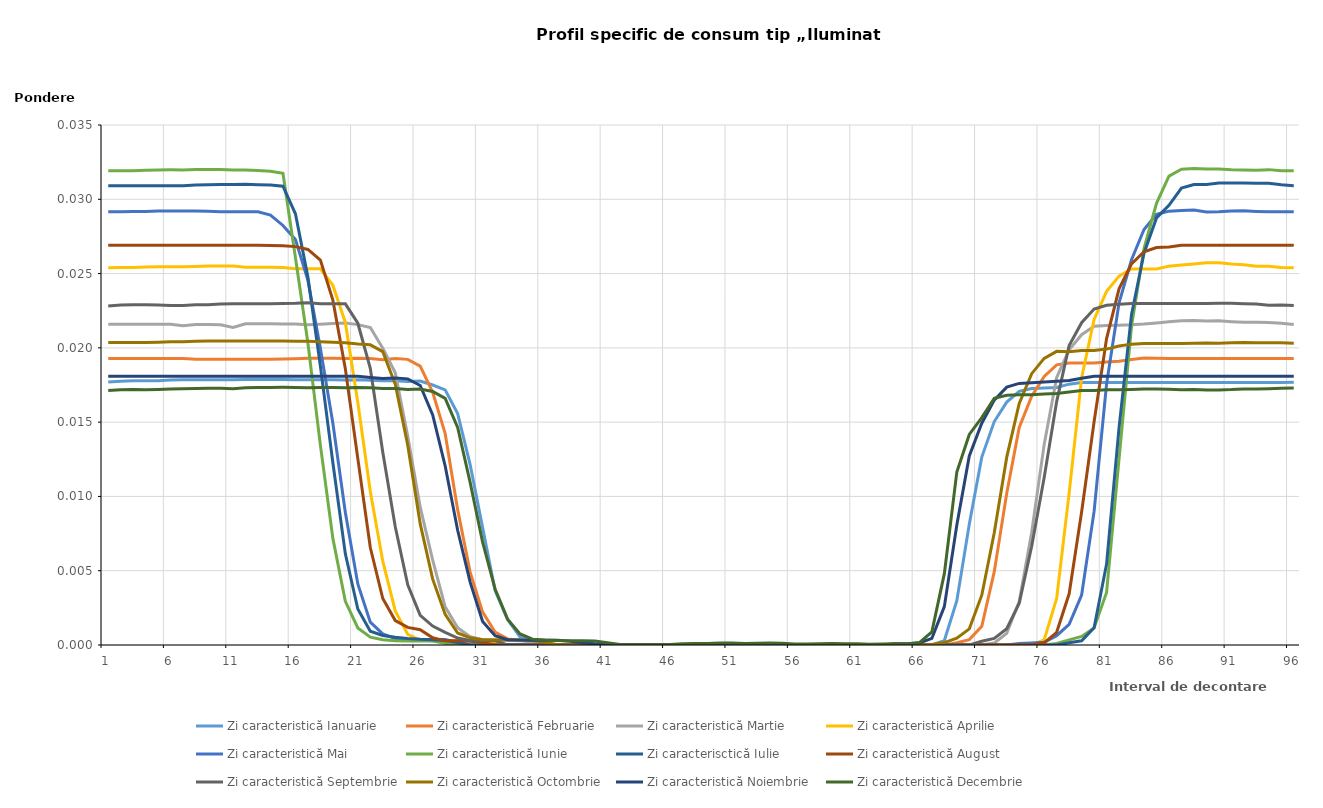
| Category | Zi caracteristică Ianuarie | Zi caracteristică Februarie | Zi caracteristică Martie | Zi caracteristică Aprilie | Zi caracteristică Mai | Zi caracteristică Iunie | Zi caracterisctică Iulie | Zi caracteristică August | Zi caracteristică Septembrie | Zi caracteristică Octombrie | Zi caracteristică Noiembrie | Zi caracteristică Decembrie |
|---|---|---|---|---|---|---|---|---|---|---|---|---|
| 1.0 | 0.018 | 0.019 | 0.022 | 0.025 | 0.029 | 0.032 | 0.031 | 0.027 | 0.023 | 0.02 | 0.018 | 0.017 |
| 2.0 | 0.018 | 0.019 | 0.022 | 0.025 | 0.029 | 0.032 | 0.031 | 0.027 | 0.023 | 0.02 | 0.018 | 0.017 |
| 3.0 | 0.018 | 0.019 | 0.022 | 0.025 | 0.029 | 0.032 | 0.031 | 0.027 | 0.023 | 0.02 | 0.018 | 0.017 |
| 4.0 | 0.018 | 0.019 | 0.022 | 0.025 | 0.029 | 0.032 | 0.031 | 0.027 | 0.023 | 0.02 | 0.018 | 0.017 |
| 5.0 | 0.018 | 0.019 | 0.022 | 0.025 | 0.029 | 0.032 | 0.031 | 0.027 | 0.023 | 0.02 | 0.018 | 0.017 |
| 6.0 | 0.018 | 0.019 | 0.022 | 0.025 | 0.029 | 0.032 | 0.031 | 0.027 | 0.023 | 0.02 | 0.018 | 0.017 |
| 7.0 | 0.018 | 0.019 | 0.021 | 0.025 | 0.029 | 0.032 | 0.031 | 0.027 | 0.023 | 0.02 | 0.018 | 0.017 |
| 8.0 | 0.018 | 0.019 | 0.022 | 0.025 | 0.029 | 0.032 | 0.031 | 0.027 | 0.023 | 0.02 | 0.018 | 0.017 |
| 9.0 | 0.018 | 0.019 | 0.022 | 0.026 | 0.029 | 0.032 | 0.031 | 0.027 | 0.023 | 0.02 | 0.018 | 0.017 |
| 10.0 | 0.018 | 0.019 | 0.022 | 0.026 | 0.029 | 0.032 | 0.031 | 0.027 | 0.023 | 0.02 | 0.018 | 0.017 |
| 11.0 | 0.018 | 0.019 | 0.021 | 0.026 | 0.029 | 0.032 | 0.031 | 0.027 | 0.023 | 0.02 | 0.018 | 0.017 |
| 12.0 | 0.018 | 0.019 | 0.022 | 0.025 | 0.029 | 0.032 | 0.031 | 0.027 | 0.023 | 0.02 | 0.018 | 0.017 |
| 13.0 | 0.018 | 0.019 | 0.022 | 0.025 | 0.029 | 0.032 | 0.031 | 0.027 | 0.023 | 0.02 | 0.018 | 0.017 |
| 14.0 | 0.018 | 0.019 | 0.022 | 0.025 | 0.029 | 0.032 | 0.031 | 0.027 | 0.023 | 0.02 | 0.018 | 0.017 |
| 15.0 | 0.018 | 0.019 | 0.022 | 0.025 | 0.028 | 0.032 | 0.031 | 0.027 | 0.023 | 0.02 | 0.018 | 0.017 |
| 16.0 | 0.018 | 0.019 | 0.022 | 0.025 | 0.027 | 0.026 | 0.029 | 0.027 | 0.023 | 0.02 | 0.018 | 0.017 |
| 17.0 | 0.018 | 0.019 | 0.022 | 0.025 | 0.025 | 0.02 | 0.025 | 0.027 | 0.023 | 0.02 | 0.018 | 0.017 |
| 18.0 | 0.018 | 0.019 | 0.022 | 0.025 | 0.02 | 0.013 | 0.019 | 0.026 | 0.023 | 0.02 | 0.018 | 0.017 |
| 19.0 | 0.018 | 0.019 | 0.022 | 0.024 | 0.015 | 0.007 | 0.012 | 0.023 | 0.023 | 0.02 | 0.018 | 0.017 |
| 20.0 | 0.018 | 0.019 | 0.022 | 0.022 | 0.009 | 0.003 | 0.006 | 0.019 | 0.023 | 0.02 | 0.018 | 0.017 |
| 21.0 | 0.018 | 0.019 | 0.022 | 0.016 | 0.004 | 0.001 | 0.002 | 0.013 | 0.022 | 0.02 | 0.018 | 0.017 |
| 22.0 | 0.018 | 0.019 | 0.021 | 0.01 | 0.002 | 0.001 | 0.001 | 0.007 | 0.019 | 0.02 | 0.018 | 0.017 |
| 23.0 | 0.018 | 0.019 | 0.02 | 0.006 | 0.001 | 0 | 0.001 | 0.003 | 0.013 | 0.02 | 0.018 | 0.017 |
| 24.0 | 0.018 | 0.019 | 0.018 | 0.002 | 0 | 0 | 0.001 | 0.002 | 0.008 | 0.018 | 0.018 | 0.017 |
| 25.0 | 0.018 | 0.019 | 0.014 | 0.001 | 0 | 0 | 0 | 0.001 | 0.004 | 0.013 | 0.018 | 0.017 |
| 26.0 | 0.018 | 0.019 | 0.009 | 0 | 0 | 0 | 0 | 0.001 | 0.002 | 0.008 | 0.017 | 0.017 |
| 27.0 | 0.018 | 0.017 | 0.006 | 0 | 0 | 0 | 0 | 0 | 0.001 | 0.004 | 0.015 | 0.017 |
| 28.0 | 0.017 | 0.014 | 0.003 | 0 | 0 | 0 | 0 | 0 | 0.001 | 0.002 | 0.012 | 0.017 |
| 29.0 | 0.016 | 0.009 | 0.001 | 0 | 0 | 0 | 0 | 0 | 0 | 0.001 | 0.008 | 0.015 |
| 30.0 | 0.012 | 0.005 | 0.001 | 0 | 0 | 0 | 0 | 0 | 0 | 0 | 0.004 | 0.011 |
| 31.0 | 0.008 | 0.002 | 0 | 0 | 0 | 0 | 0 | 0 | 0 | 0 | 0.002 | 0.007 |
| 32.0 | 0.004 | 0.001 | 0 | 0 | 0 | 0 | 0 | 0 | 0 | 0 | 0.001 | 0.004 |
| 33.0 | 0.002 | 0 | 0 | 0 | 0 | 0 | 0 | 0 | 0 | 0 | 0 | 0.002 |
| 34.0 | 0.001 | 0 | 0 | 0 | 0 | 0 | 0 | 0 | 0 | 0 | 0 | 0.001 |
| 35.0 | 0 | 0 | 0 | 0 | 0 | 0 | 0 | 0 | 0 | 0 | 0 | 0 |
| 36.0 | 0 | 0 | 0 | 0 | 0 | 0 | 0 | 0 | 0 | 0 | 0 | 0 |
| 37.0 | 0 | 0 | 0 | 0 | 0 | 0 | 0 | 0 | 0 | 0 | 0 | 0 |
| 38.0 | 0 | 0 | 0 | 0 | 0 | 0 | 0 | 0 | 0 | 0 | 0 | 0 |
| 39.0 | 0 | 0 | 0 | 0 | 0 | 0 | 0 | 0 | 0 | 0 | 0 | 0 |
| 40.0 | 0 | 0 | 0 | 0 | 0 | 0 | 0 | 0 | 0 | 0 | 0 | 0 |
| 41.0 | 0 | 0 | 0 | 0 | 0 | 0 | 0 | 0 | 0 | 0 | 0 | 0 |
| 42.0 | 0 | 0 | 0 | 0 | 0 | 0 | 0 | 0 | 0 | 0 | 0 | 0 |
| 43.0 | 0 | 0 | 0 | 0 | 0 | 0 | 0 | 0 | 0 | 0 | 0 | 0 |
| 44.0 | 0 | 0 | 0 | 0 | 0 | 0 | 0 | 0 | 0 | 0 | 0 | 0 |
| 45.0 | 0 | 0 | 0 | 0 | 0 | 0 | 0 | 0 | 0 | 0 | 0 | 0 |
| 46.0 | 0 | 0 | 0 | 0 | 0 | 0 | 0 | 0 | 0 | 0 | 0 | 0 |
| 47.0 | 0 | 0 | 0 | 0 | 0 | 0 | 0 | 0 | 0 | 0 | 0 | 0 |
| 48.0 | 0 | 0 | 0 | 0 | 0 | 0 | 0 | 0 | 0 | 0 | 0 | 0 |
| 49.0 | 0 | 0 | 0 | 0 | 0 | 0 | 0 | 0 | 0 | 0 | 0 | 0 |
| 50.0 | 0 | 0 | 0 | 0 | 0 | 0 | 0 | 0 | 0 | 0 | 0 | 0 |
| 51.0 | 0 | 0 | 0 | 0 | 0 | 0 | 0 | 0 | 0 | 0 | 0 | 0 |
| 52.0 | 0 | 0 | 0 | 0 | 0 | 0 | 0 | 0 | 0 | 0 | 0 | 0 |
| 53.0 | 0 | 0 | 0 | 0 | 0 | 0 | 0 | 0 | 0 | 0 | 0 | 0 |
| 54.0 | 0 | 0 | 0 | 0 | 0 | 0 | 0 | 0 | 0 | 0 | 0 | 0 |
| 55.0 | 0 | 0 | 0 | 0 | 0 | 0 | 0 | 0 | 0 | 0 | 0 | 0 |
| 56.0 | 0 | 0 | 0 | 0 | 0 | 0 | 0 | 0 | 0 | 0 | 0 | 0 |
| 57.0 | 0 | 0 | 0 | 0 | 0 | 0 | 0 | 0 | 0 | 0 | 0 | 0 |
| 58.0 | 0 | 0 | 0 | 0 | 0 | 0 | 0 | 0 | 0 | 0 | 0 | 0 |
| 59.0 | 0 | 0 | 0 | 0 | 0 | 0 | 0 | 0 | 0 | 0 | 0 | 0 |
| 60.0 | 0 | 0 | 0 | 0 | 0 | 0 | 0 | 0 | 0 | 0 | 0 | 0 |
| 61.0 | 0 | 0 | 0 | 0 | 0 | 0 | 0 | 0 | 0 | 0 | 0 | 0 |
| 62.0 | 0 | 0 | 0 | 0 | 0 | 0 | 0 | 0 | 0 | 0 | 0 | 0 |
| 63.0 | 0 | 0 | 0 | 0 | 0 | 0 | 0 | 0 | 0 | 0 | 0 | 0 |
| 64.0 | 0 | 0 | 0 | 0 | 0 | 0 | 0 | 0 | 0 | 0 | 0 | 0 |
| 65.0 | 0 | 0 | 0 | 0 | 0 | 0 | 0 | 0 | 0 | 0 | 0 | 0 |
| 66.0 | 0 | 0 | 0 | 0 | 0 | 0 | 0 | 0 | 0 | 0 | 0 | 0 |
| 67.0 | 0 | 0 | 0 | 0 | 0 | 0 | 0 | 0 | 0 | 0 | 0 | 0.001 |
| 68.0 | 0 | 0 | 0 | 0 | 0 | 0 | 0 | 0 | 0 | 0 | 0.003 | 0.005 |
| 69.0 | 0.003 | 0 | 0 | 0 | 0 | 0 | 0 | 0 | 0 | 0 | 0.008 | 0.012 |
| 70.0 | 0.008 | 0 | 0 | 0 | 0 | 0 | 0 | 0 | 0 | 0.001 | 0.013 | 0.014 |
| 71.0 | 0.013 | 0.001 | 0 | 0 | 0 | 0 | 0 | 0 | 0 | 0.003 | 0.015 | 0.015 |
| 72.0 | 0.015 | 0.005 | 0 | 0 | 0 | 0 | 0 | 0 | 0 | 0.008 | 0.016 | 0.017 |
| 73.0 | 0.016 | 0.01 | 0.001 | 0 | 0 | 0 | 0 | 0 | 0.001 | 0.013 | 0.017 | 0.017 |
| 74.0 | 0.017 | 0.015 | 0.003 | 0 | 0 | 0 | 0 | 0 | 0.003 | 0.016 | 0.018 | 0.017 |
| 75.0 | 0.017 | 0.017 | 0.008 | 0 | 0 | 0 | 0 | 0 | 0.007 | 0.018 | 0.018 | 0.017 |
| 76.0 | 0.017 | 0.018 | 0.014 | 0 | 0 | 0 | 0 | 0 | 0.011 | 0.019 | 0.018 | 0.017 |
| 77.0 | 0.017 | 0.019 | 0.018 | 0.003 | 0.001 | 0 | 0 | 0.001 | 0.016 | 0.02 | 0.018 | 0.017 |
| 78.0 | 0.018 | 0.019 | 0.02 | 0.01 | 0.001 | 0 | 0 | 0.003 | 0.02 | 0.02 | 0.018 | 0.017 |
| 79.0 | 0.018 | 0.019 | 0.021 | 0.018 | 0.003 | 0.001 | 0 | 0.009 | 0.022 | 0.02 | 0.018 | 0.017 |
| 80.0 | 0.018 | 0.019 | 0.021 | 0.022 | 0.009 | 0.001 | 0.001 | 0.015 | 0.023 | 0.02 | 0.018 | 0.017 |
| 81.0 | 0.018 | 0.019 | 0.022 | 0.024 | 0.018 | 0.004 | 0.005 | 0.021 | 0.023 | 0.02 | 0.018 | 0.017 |
| 82.0 | 0.018 | 0.019 | 0.022 | 0.025 | 0.023 | 0.013 | 0.015 | 0.024 | 0.023 | 0.02 | 0.018 | 0.017 |
| 83.0 | 0.018 | 0.019 | 0.022 | 0.025 | 0.026 | 0.021 | 0.022 | 0.026 | 0.023 | 0.02 | 0.018 | 0.017 |
| 84.0 | 0.018 | 0.019 | 0.022 | 0.025 | 0.028 | 0.027 | 0.026 | 0.026 | 0.023 | 0.02 | 0.018 | 0.017 |
| 85.0 | 0.018 | 0.019 | 0.022 | 0.025 | 0.029 | 0.03 | 0.029 | 0.027 | 0.023 | 0.02 | 0.018 | 0.017 |
| 86.0 | 0.018 | 0.019 | 0.022 | 0.026 | 0.029 | 0.032 | 0.03 | 0.027 | 0.023 | 0.02 | 0.018 | 0.017 |
| 87.0 | 0.018 | 0.019 | 0.022 | 0.026 | 0.029 | 0.032 | 0.031 | 0.027 | 0.023 | 0.02 | 0.018 | 0.017 |
| 88.0 | 0.018 | 0.019 | 0.022 | 0.026 | 0.029 | 0.032 | 0.031 | 0.027 | 0.023 | 0.02 | 0.018 | 0.017 |
| 89.0 | 0.018 | 0.019 | 0.022 | 0.026 | 0.029 | 0.032 | 0.031 | 0.027 | 0.023 | 0.02 | 0.018 | 0.017 |
| 90.0 | 0.018 | 0.019 | 0.022 | 0.026 | 0.029 | 0.032 | 0.031 | 0.027 | 0.023 | 0.02 | 0.018 | 0.017 |
| 91.0 | 0.018 | 0.019 | 0.022 | 0.026 | 0.029 | 0.032 | 0.031 | 0.027 | 0.023 | 0.02 | 0.018 | 0.017 |
| 92.0 | 0.018 | 0.019 | 0.022 | 0.026 | 0.029 | 0.032 | 0.031 | 0.027 | 0.023 | 0.02 | 0.018 | 0.017 |
| 93.0 | 0.018 | 0.019 | 0.022 | 0.025 | 0.029 | 0.032 | 0.031 | 0.027 | 0.023 | 0.02 | 0.018 | 0.017 |
| 94.0 | 0.018 | 0.019 | 0.022 | 0.025 | 0.029 | 0.032 | 0.031 | 0.027 | 0.023 | 0.02 | 0.018 | 0.017 |
| 95.0 | 0.018 | 0.019 | 0.022 | 0.025 | 0.029 | 0.032 | 0.031 | 0.027 | 0.023 | 0.02 | 0.018 | 0.017 |
| 96.0 | 0.018 | 0.019 | 0.022 | 0.025 | 0.029 | 0.032 | 0.031 | 0.027 | 0.023 | 0.02 | 0.018 | 0.017 |